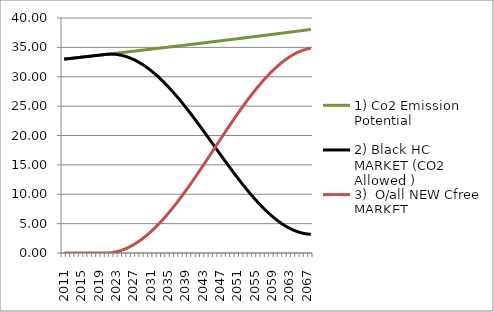
| Category | 1) Co2 Emission Potential  | 2) Black HC MARKET (CO2 Allowed ) | 3)  O/all NEW Cfree MARKET |
|---|---|---|---|
| 2011.0 | 33 | 33 | 0 |
| 2012.0 | 33.082 | 33.082 | 0 |
| 2013.0 | 33.165 | 33.165 | 0 |
| 2014.0 | 33.248 | 33.248 | 0 |
| 2015.0 | 33.331 | 33.331 | 0 |
| 2016.0 | 33.415 | 33.415 | 0 |
| 2017.0 | 33.498 | 33.498 | 0 |
| 2018.0 | 33.582 | 33.582 | 0 |
| 2019.0 | 33.666 | 33.666 | 0 |
| 2020.0 | 33.75 | 33.75 | 0 |
| 2021.0 | 33.834 | 33.834 | 0 |
| 2022.0 | 33.919 | 33.852 | 0.067 |
| 2023.0 | 34.004 | 33.804 | 0.2 |
| 2024.0 | 34.089 | 33.689 | 0.4 |
| 2025.0 | 34.174 | 33.508 | 0.666 |
| 2026.0 | 34.259 | 33.261 | 0.998 |
| 2027.0 | 34.345 | 32.95 | 1.395 |
| 2028.0 | 34.431 | 32.576 | 1.855 |
| 2029.0 | 34.517 | 32.139 | 2.378 |
| 2030.0 | 34.603 | 31.643 | 2.96 |
| 2031.0 | 34.69 | 31.088 | 3.601 |
| 2032.0 | 34.777 | 30.478 | 4.298 |
| 2033.0 | 34.863 | 29.815 | 5.049 |
| 2034.0 | 34.951 | 29.101 | 5.85 |
| 2035.0 | 35.038 | 28.34 | 6.698 |
| 2036.0 | 35.126 | 27.535 | 7.591 |
| 2037.0 | 35.213 | 26.689 | 8.525 |
| 2038.0 | 35.301 | 25.805 | 9.496 |
| 2039.0 | 35.39 | 24.889 | 10.501 |
| 2040.0 | 35.478 | 23.943 | 11.535 |
| 2041.0 | 35.567 | 22.973 | 12.594 |
| 2042.0 | 35.656 | 21.981 | 13.675 |
| 2043.0 | 35.745 | 20.973 | 14.772 |
| 2044.0 | 35.834 | 19.952 | 15.882 |
| 2045.0 | 35.924 | 18.925 | 16.999 |
| 2046.0 | 36.014 | 17.894 | 18.12 |
| 2047.0 | 36.104 | 16.865 | 19.239 |
| 2048.0 | 36.194 | 15.842 | 20.352 |
| 2049.0 | 36.284 | 14.83 | 21.454 |
| 2050.0 | 36.375 | 13.834 | 22.541 |
| 2051.0 | 36.466 | 12.858 | 23.608 |
| 2052.0 | 36.557 | 11.906 | 24.651 |
| 2053.0 | 36.649 | 10.984 | 25.665 |
| 2054.0 | 36.74 | 10.095 | 26.645 |
| 2055.0 | 36.832 | 9.243 | 27.589 |
| 2056.0 | 36.924 | 8.434 | 28.49 |
| 2057.0 | 37.017 | 7.67 | 29.347 |
| 2058.0 | 37.109 | 6.955 | 30.154 |
| 2059.0 | 37.202 | 6.293 | 30.909 |
| 2060.0 | 37.295 | 5.687 | 31.608 |
| 2061.0 | 37.388 | 5.14 | 32.248 |
| 2062.0 | 37.482 | 4.656 | 32.826 |
| 2063.0 | 37.575 | 4.236 | 33.339 |
| 2064.0 | 37.669 | 3.883 | 33.786 |
| 2065.0 | 37.763 | 3.6 | 34.164 |
| 2066.0 | 37.858 | 3.387 | 34.471 |
| 2067.0 | 37.952 | 3.247 | 34.705 |
| 2068.0 | 38.047 | 3.181 | 34.867 |